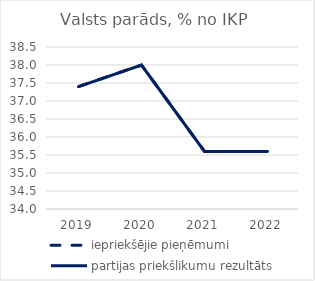
| Category | iepriekšējie pieņēmumi | partijas priekšlikumu rezultāts |
|---|---|---|
| 2019.0 | 37.4 | 37.4 |
| 2020.0 | 38 | 38 |
| 2021.0 | 35.6 | 35.6 |
| 2022.0 | 35.6 | 35.6 |